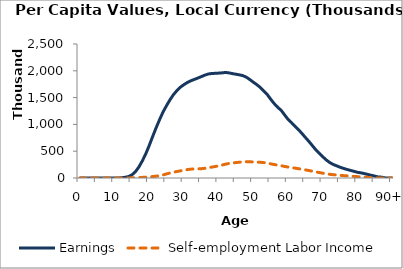
| Category | Earnings | Self-employment Labor Income |
|---|---|---|
| 0 | 0 | 0 |
|  | 0 | 0 |
| 2 | 0 | 0 |
| 3 | 0 | 0 |
| 4 | 0 | 0 |
| 5 | 0 | 0 |
| 6 | 0 | 0 |
| 7 | 0 | 0 |
| 8 | 0 | 0 |
| 9 | 0 | 0 |
| 10 | 0 | 0 |
| 11 | 0 | 0 |
| 12 | 5193.666 | 547.549 |
| 13 | 12188.918 | 909.888 |
| 14 | 26461.168 | 1549.903 |
| 15 | 56409.814 | 3051.103 |
| 16 | 114654.597 | 4955.422 |
| 17 | 202049.386 | 7456.268 |
| 18 | 315510.223 | 11146.513 |
| 19 | 448372.153 | 15873.889 |
| 20 | 604742.526 | 21372.373 |
| 21 | 773929.12 | 27150.019 |
| 22 | 937216.05 | 34089.842 |
| 23 | 1090340.32 | 43832.717 |
| 24 | 1232628.23 | 57398.397 |
| 25 | 1350702.11 | 76239.628 |
| 26 | 1460375.09 | 92698.526 |
| 27 | 1555644.96 | 107717.8 |
| 28 | 1632112.58 | 120859.83 |
| 29 | 1694810.97 | 133399.18 |
| 30 | 1741820.91 | 145057.93 |
| 31 | 1782121.19 | 156657.1 |
| 32 | 1813490.95 | 164995.24 |
| 33 | 1839376.58 | 169183.84 |
| 34 | 1864194.58 | 171105.94 |
| 35 | 1890954.38 | 173434.31 |
| 36 | 1918442.15 | 181008.63 |
| 37 | 1940063.78 | 191966.59 |
| 38 | 1949693.57 | 202858.86 |
| 39 | 1952864.64 | 214002.15 |
| 40 | 1956863.94 | 226814.26 |
| 41 | 1961611.96 | 242116.72 |
| 42 | 1968686.36 | 257985.7 |
| 43 | 1960705.82 | 272000.87 |
| 44 | 1947112.18 | 280974.28 |
| 45 | 1935641.79 | 288011.76 |
| 46 | 1924640.27 | 294838.18 |
| 47 | 1909147.25 | 300833.86 |
| 48 | 1880034.25 | 303590.66 |
| 49 | 1835809.42 | 301453.61 |
| 50 | 1787154.18 | 300137.55 |
| 51 | 1741509.1 | 297651.7 |
| 52 | 1688836.38 | 293379.38 |
| 53 | 1620335.53 | 286983.16 |
| 54 | 1557413.63 | 279090.94 |
| 55 | 1468811.42 | 263823.11 |
| 56 | 1388735.95 | 251796.96 |
| 57 | 1319099.71 | 239001.19 |
| 58 | 1263460.22 | 229082.11 |
| 59 | 1177360.71 | 215250.34 |
| 60 | 1092707.35 | 204428.93 |
| 61 | 1032066.08 | 195301.53 |
| 62 | 966003.15 | 184584.29 |
| 63 | 901590.29 | 174130.25 |
| 64 | 830245.84 | 162077.67 |
| 65 | 754756.44 | 151391.3 |
| 66 | 682453.937 | 139174.4 |
| 67 | 602880.002 | 126900.15 |
| 68 | 525836.537 | 114380.78 |
| 69 | 459951.041 | 101705.28 |
| 70 | 396082.198 | 89402.521 |
| 71 | 336059.276 | 78106.502 |
| 72 | 287943.637 | 68881.093 |
| 73 | 252409.943 | 61583.514 |
| 74 | 226632.969 | 55810.898 |
| 75 | 200317.132 | 49869.439 |
| 76 | 178416.876 | 44538.937 |
| 77 | 158463.985 | 39433.84 |
| 78 | 141397.452 | 34546.885 |
| 79 | 123787.788 | 29716.491 |
| 80 | 106213.327 | 24870.35 |
| 81 | 95995.209 | 20732.269 |
| 82 | 81450.865 | 16281.772 |
| 83 | 65778.51 | 11753.752 |
| 84 | 50105.281 | 7262.762 |
| 85 | 34442.274 | 2815.33 |
| 86 | 18803.687 | 0 |
| 87 | 15251.189 | 0 |
| 88 | 1832.581 | 0 |
| 89 | 0 | 0 |
| 90+ | 0 | 0 |